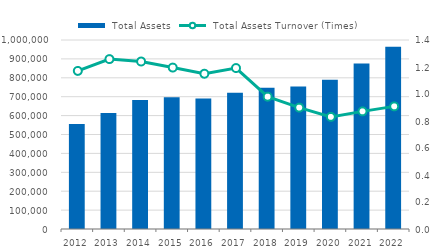
| Category |  Total Assets |
|---|---|
| 2012.0 | 555480 |
| 2013.0 | 614170.5 |
| 2014.0 | 682857.5 |
| 2015.0 | 697168 |
| 2016.0 | 690513 |
| 2017.0 | 721326.5 |
| 2018.0 | 747415 |
| 2019.0 | 754001 |
| 2020.0 | 789251.5 |
| 2021.0 | 875504 |
| 2022.0 | 964394.5 |